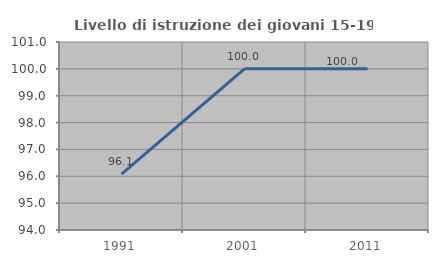
| Category | Livello di istruzione dei giovani 15-19 anni |
|---|---|
| 1991.0 | 96.078 |
| 2001.0 | 100 |
| 2011.0 | 100 |